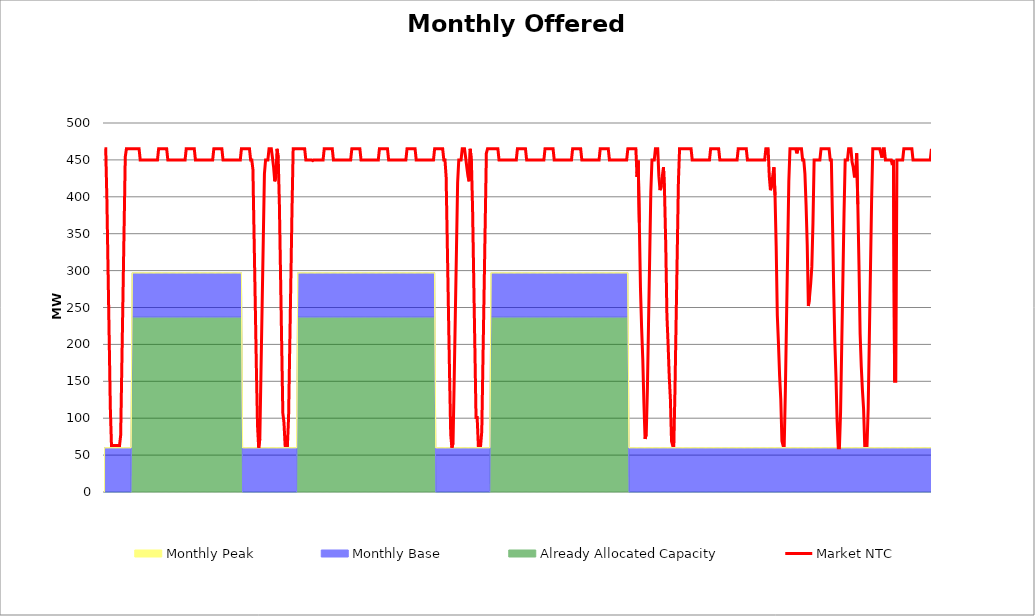
| Category | Market NTC |
|---|---|
| 0 | 465 |
| 1 | 465 |
| 2 | 397 |
| 3 | 303 |
| 4 | 209 |
| 5 | 114 |
| 6 | 63 |
| 7 | 63 |
| 8 | 63 |
| 9 | 63 |
| 10 | 63 |
| 11 | 63 |
| 12 | 63 |
| 13 | 63 |
| 14 | 77 |
| 15 | 171 |
| 16 | 265 |
| 17 | 360 |
| 18 | 454 |
| 19 | 465 |
| 20 | 465 |
| 21 | 465 |
| 22 | 465 |
| 23 | 465 |
| 24 | 465 |
| 25 | 465 |
| 26 | 465 |
| 27 | 465 |
| 28 | 465 |
| 29 | 465 |
| 30 | 465 |
| 31 | 450 |
| 32 | 450 |
| 33 | 450 |
| 34 | 450 |
| 35 | 450 |
| 36 | 450 |
| 37 | 450 |
| 38 | 450 |
| 39 | 450 |
| 40 | 450 |
| 41 | 450 |
| 42 | 450 |
| 43 | 450 |
| 44 | 450 |
| 45 | 450 |
| 46 | 450 |
| 47 | 465 |
| 48 | 465 |
| 49 | 465 |
| 50 | 465 |
| 51 | 465 |
| 52 | 465 |
| 53 | 465 |
| 54 | 465 |
| 55 | 450 |
| 56 | 450 |
| 57 | 450 |
| 58 | 450 |
| 59 | 450 |
| 60 | 450 |
| 61 | 450 |
| 62 | 450 |
| 63 | 450 |
| 64 | 450 |
| 65 | 450 |
| 66 | 450 |
| 67 | 450 |
| 68 | 450 |
| 69 | 450 |
| 70 | 450 |
| 71 | 465 |
| 72 | 465 |
| 73 | 465 |
| 74 | 465 |
| 75 | 465 |
| 76 | 465 |
| 77 | 465 |
| 78 | 465 |
| 79 | 450 |
| 80 | 450 |
| 81 | 450 |
| 82 | 450 |
| 83 | 450 |
| 84 | 450 |
| 85 | 450 |
| 86 | 450 |
| 87 | 450 |
| 88 | 450 |
| 89 | 450 |
| 90 | 450 |
| 91 | 450 |
| 92 | 450 |
| 93 | 450 |
| 94 | 450 |
| 95 | 465 |
| 96 | 465 |
| 97 | 465 |
| 98 | 465 |
| 99 | 465 |
| 100 | 465 |
| 101 | 465 |
| 102 | 465 |
| 103 | 450 |
| 104 | 450 |
| 105 | 450 |
| 106 | 450 |
| 107 | 450 |
| 108 | 450 |
| 109 | 450 |
| 110 | 450 |
| 111 | 450 |
| 112 | 450 |
| 113 | 450 |
| 114 | 450 |
| 115 | 450 |
| 116 | 450 |
| 117 | 450 |
| 118 | 450 |
| 119 | 465 |
| 120 | 465 |
| 121 | 465 |
| 122 | 465 |
| 123 | 465 |
| 124 | 465 |
| 125 | 465 |
| 126 | 465 |
| 127 | 450 |
| 128 | 450 |
| 129 | 437 |
| 130 | 347 |
| 131 | 258 |
| 132 | 168 |
| 133 | 90 |
| 134 | 60 |
| 135 | 72 |
| 136 | 162 |
| 137 | 252 |
| 138 | 341 |
| 139 | 431 |
| 140 | 450 |
| 141 | 450 |
| 142 | 450 |
| 143 | 465 |
| 144 | 465 |
| 145 | 465 |
| 146 | 453 |
| 147 | 440 |
| 148 | 421 |
| 149 | 428 |
| 150 | 465 |
| 151 | 453 |
| 152 | 390 |
| 153 | 296 |
| 154 | 201 |
| 155 | 107 |
| 156 | 94 |
| 157 | 63 |
| 158 | 63 |
| 159 | 63 |
| 160 | 101 |
| 161 | 195 |
| 162 | 289 |
| 163 | 384 |
| 164 | 465 |
| 165 | 465 |
| 166 | 465 |
| 167 | 465 |
| 168 | 465 |
| 169 | 465 |
| 170 | 465 |
| 171 | 465 |
| 172 | 465 |
| 173 | 465 |
| 174 | 465 |
| 175 | 450 |
| 176 | 450 |
| 177 | 450 |
| 178 | 450 |
| 179 | 450 |
| 180 | 450 |
| 181 | 449 |
| 182 | 450 |
| 183 | 450 |
| 184 | 450 |
| 185 | 450 |
| 186 | 450 |
| 187 | 450 |
| 188 | 450 |
| 189 | 450 |
| 190 | 450 |
| 191 | 465 |
| 192 | 465 |
| 193 | 465 |
| 194 | 465 |
| 195 | 465 |
| 196 | 465 |
| 197 | 465 |
| 198 | 465 |
| 199 | 450 |
| 200 | 450 |
| 201 | 450 |
| 202 | 450 |
| 203 | 450 |
| 204 | 450 |
| 205 | 450 |
| 206 | 450 |
| 207 | 450 |
| 208 | 450 |
| 209 | 450 |
| 210 | 450 |
| 211 | 450 |
| 212 | 450 |
| 213 | 450 |
| 214 | 450 |
| 215 | 465 |
| 216 | 465 |
| 217 | 465 |
| 218 | 465 |
| 219 | 465 |
| 220 | 465 |
| 221 | 465 |
| 222 | 465 |
| 223 | 450 |
| 224 | 450 |
| 225 | 450 |
| 226 | 450 |
| 227 | 450 |
| 228 | 450 |
| 229 | 450 |
| 230 | 450 |
| 231 | 450 |
| 232 | 450 |
| 233 | 450 |
| 234 | 450 |
| 235 | 450 |
| 236 | 450 |
| 237 | 450 |
| 238 | 450 |
| 239 | 465 |
| 240 | 465 |
| 241 | 465 |
| 242 | 465 |
| 243 | 465 |
| 244 | 465 |
| 245 | 465 |
| 246 | 465 |
| 247 | 450 |
| 248 | 450 |
| 249 | 450 |
| 250 | 450 |
| 251 | 450 |
| 252 | 450 |
| 253 | 450 |
| 254 | 450 |
| 255 | 450 |
| 256 | 450 |
| 257 | 450 |
| 258 | 450 |
| 259 | 450 |
| 260 | 450 |
| 261 | 450 |
| 262 | 450 |
| 263 | 465 |
| 264 | 465 |
| 265 | 465 |
| 266 | 465 |
| 267 | 465 |
| 268 | 465 |
| 269 | 465 |
| 270 | 465 |
| 271 | 450 |
| 272 | 450 |
| 273 | 450 |
| 274 | 450 |
| 275 | 450 |
| 276 | 450 |
| 277 | 450 |
| 278 | 450 |
| 279 | 450 |
| 280 | 450 |
| 281 | 450 |
| 282 | 450 |
| 283 | 450 |
| 284 | 450 |
| 285 | 450 |
| 286 | 450 |
| 287 | 465 |
| 288 | 465 |
| 289 | 465 |
| 290 | 465 |
| 291 | 465 |
| 292 | 465 |
| 293 | 465 |
| 294 | 465 |
| 295 | 450 |
| 296 | 450 |
| 297 | 427 |
| 298 | 338 |
| 299 | 248 |
| 300 | 158 |
| 301 | 78 |
| 302 | 60 |
| 303 | 66 |
| 304 | 150 |
| 305 | 240 |
| 306 | 329 |
| 307 | 419 |
| 308 | 450 |
| 309 | 450 |
| 310 | 450 |
| 311 | 465 |
| 312 | 465 |
| 313 | 465 |
| 314 | 453 |
| 315 | 440 |
| 316 | 428 |
| 317 | 421 |
| 318 | 465 |
| 319 | 447 |
| 320 | 384 |
| 321 | 289 |
| 322 | 195 |
| 323 | 101 |
| 324 | 101 |
| 325 | 63 |
| 326 | 63 |
| 327 | 63 |
| 328 | 82 |
| 329 | 176 |
| 330 | 270 |
| 331 | 365 |
| 332 | 459 |
| 333 | 465 |
| 334 | 465 |
| 335 | 465 |
| 336 | 465 |
| 337 | 465 |
| 338 | 465 |
| 339 | 465 |
| 340 | 465 |
| 341 | 465 |
| 342 | 465 |
| 343 | 450 |
| 344 | 450 |
| 345 | 450 |
| 346 | 450 |
| 347 | 450 |
| 348 | 450 |
| 349 | 450 |
| 350 | 450 |
| 351 | 450 |
| 352 | 450 |
| 353 | 450 |
| 354 | 450 |
| 355 | 450 |
| 356 | 450 |
| 357 | 450 |
| 358 | 450 |
| 359 | 465 |
| 360 | 465 |
| 361 | 465 |
| 362 | 465 |
| 363 | 465 |
| 364 | 465 |
| 365 | 465 |
| 366 | 465 |
| 367 | 450 |
| 368 | 450 |
| 369 | 450 |
| 370 | 450 |
| 371 | 450 |
| 372 | 450 |
| 373 | 450 |
| 374 | 450 |
| 375 | 450 |
| 376 | 450 |
| 377 | 450 |
| 378 | 450 |
| 379 | 450 |
| 380 | 450 |
| 381 | 450 |
| 382 | 450 |
| 383 | 465 |
| 384 | 465 |
| 385 | 465 |
| 386 | 465 |
| 387 | 465 |
| 388 | 465 |
| 389 | 465 |
| 390 | 465 |
| 391 | 450 |
| 392 | 450 |
| 393 | 450 |
| 394 | 450 |
| 395 | 450 |
| 396 | 450 |
| 397 | 450 |
| 398 | 450 |
| 399 | 450 |
| 400 | 450 |
| 401 | 450 |
| 402 | 450 |
| 403 | 450 |
| 404 | 450 |
| 405 | 450 |
| 406 | 450 |
| 407 | 465 |
| 408 | 465 |
| 409 | 465 |
| 410 | 465 |
| 411 | 465 |
| 412 | 465 |
| 413 | 465 |
| 414 | 465 |
| 415 | 450 |
| 416 | 450 |
| 417 | 450 |
| 418 | 450 |
| 419 | 450 |
| 420 | 450 |
| 421 | 450 |
| 422 | 450 |
| 423 | 450 |
| 424 | 450 |
| 425 | 450 |
| 426 | 450 |
| 427 | 450 |
| 428 | 450 |
| 429 | 450 |
| 430 | 450 |
| 431 | 465 |
| 432 | 465 |
| 433 | 465 |
| 434 | 465 |
| 435 | 465 |
| 436 | 465 |
| 437 | 465 |
| 438 | 465 |
| 439 | 450 |
| 440 | 450 |
| 441 | 450 |
| 442 | 450 |
| 443 | 450 |
| 444 | 450 |
| 445 | 450 |
| 446 | 450 |
| 447 | 450 |
| 448 | 450 |
| 449 | 450 |
| 450 | 450 |
| 451 | 450 |
| 452 | 450 |
| 453 | 450 |
| 454 | 450 |
| 455 | 465 |
| 456 | 465 |
| 457 | 465 |
| 458 | 465 |
| 459 | 465 |
| 460 | 465 |
| 461 | 465 |
| 462 | 465 |
| 463 | 427 |
| 464 | 449 |
| 465 | 365 |
| 466 | 276 |
| 467 | 222 |
| 468 | 180 |
| 469 | 120 |
| 470 | 72 |
| 471 | 78 |
| 472 | 138 |
| 473 | 228 |
| 474 | 317 |
| 475 | 407 |
| 476 | 450 |
| 477 | 450 |
| 478 | 450 |
| 479 | 465 |
| 480 | 465 |
| 481 | 465 |
| 482 | 428 |
| 483 | 409 |
| 484 | 415 |
| 485 | 428 |
| 486 | 440 |
| 487 | 402 |
| 488 | 333 |
| 489 | 239 |
| 490 | 201 |
| 491 | 157 |
| 492 | 126 |
| 493 | 69 |
| 494 | 63 |
| 495 | 63 |
| 496 | 138 |
| 497 | 233 |
| 498 | 327 |
| 499 | 421 |
| 500 | 465 |
| 501 | 465 |
| 502 | 465 |
| 503 | 465 |
| 504 | 465 |
| 505 | 465 |
| 506 | 465 |
| 507 | 465 |
| 508 | 465 |
| 509 | 465 |
| 510 | 465 |
| 511 | 450 |
| 512 | 450 |
| 513 | 450 |
| 514 | 450 |
| 515 | 450 |
| 516 | 450 |
| 517 | 450 |
| 518 | 450 |
| 519 | 450 |
| 520 | 450 |
| 521 | 450 |
| 522 | 450 |
| 523 | 450 |
| 524 | 450 |
| 525 | 450 |
| 526 | 450 |
| 527 | 465 |
| 528 | 465 |
| 529 | 465 |
| 530 | 465 |
| 531 | 465 |
| 532 | 465 |
| 533 | 465 |
| 534 | 465 |
| 535 | 450 |
| 536 | 450 |
| 537 | 450 |
| 538 | 450 |
| 539 | 450 |
| 540 | 450 |
| 541 | 450 |
| 542 | 450 |
| 543 | 450 |
| 544 | 450 |
| 545 | 450 |
| 546 | 450 |
| 547 | 450 |
| 548 | 450 |
| 549 | 450 |
| 550 | 450 |
| 551 | 465 |
| 552 | 465 |
| 553 | 465 |
| 554 | 465 |
| 555 | 465 |
| 556 | 465 |
| 557 | 465 |
| 558 | 465 |
| 559 | 450 |
| 560 | 450 |
| 561 | 450 |
| 562 | 450 |
| 563 | 450 |
| 564 | 450 |
| 565 | 450 |
| 566 | 450 |
| 567 | 450 |
| 568 | 450 |
| 569 | 450 |
| 570 | 450 |
| 571 | 450 |
| 572 | 450 |
| 573 | 450 |
| 574 | 450 |
| 575 | 465 |
| 576 | 465 |
| 577 | 465 |
| 578 | 428 |
| 579 | 409 |
| 580 | 415 |
| 581 | 428 |
| 582 | 440 |
| 583 | 402 |
| 584 | 333 |
| 585 | 239 |
| 586 | 201 |
| 587 | 157 |
| 588 | 126 |
| 589 | 69 |
| 590 | 63 |
| 591 | 63 |
| 592 | 138 |
| 593 | 233 |
| 594 | 327 |
| 595 | 421 |
| 596 | 465 |
| 597 | 465 |
| 598 | 465 |
| 599 | 465 |
| 600 | 465 |
| 601 | 465 |
| 602 | 459 |
| 603 | 465 |
| 604 | 465 |
| 605 | 465 |
| 606 | 465 |
| 607 | 450 |
| 608 | 450 |
| 609 | 431 |
| 610 | 389 |
| 611 | 335 |
| 612 | 252 |
| 613 | 264 |
| 614 | 282 |
| 615 | 305 |
| 616 | 365 |
| 617 | 450 |
| 618 | 450 |
| 619 | 450 |
| 620 | 450 |
| 621 | 450 |
| 622 | 450 |
| 623 | 465 |
| 624 | 465 |
| 625 | 465 |
| 626 | 465 |
| 627 | 465 |
| 628 | 465 |
| 629 | 465 |
| 630 | 465 |
| 631 | 450 |
| 632 | 450 |
| 633 | 365 |
| 634 | 276 |
| 635 | 204 |
| 636 | 156 |
| 637 | 96 |
| 638 | 60 |
| 639 | 60 |
| 640 | 108 |
| 641 | 198 |
| 642 | 287 |
| 643 | 377 |
| 644 | 450 |
| 645 | 450 |
| 646 | 450 |
| 647 | 465 |
| 648 | 465 |
| 649 | 465 |
| 650 | 447 |
| 651 | 440 |
| 652 | 428 |
| 653 | 428 |
| 654 | 459 |
| 655 | 390 |
| 656 | 308 |
| 657 | 214 |
| 658 | 170 |
| 659 | 138 |
| 660 | 113 |
| 661 | 63 |
| 662 | 63 |
| 663 | 63 |
| 664 | 113 |
| 665 | 208 |
| 666 | 302 |
| 667 | 396 |
| 668 | 465 |
| 669 | 465 |
| 670 | 465 |
| 671 | 465 |
| 672 | 465 |
| 673 | 465 |
| 674 | 465 |
| 675 | 459 |
| 676 | 453 |
| 677 | 465 |
| 678 | 465 |
| 679 | 450 |
| 680 | 450 |
| 681 | 450 |
| 682 | 450 |
| 683 | 450 |
| 684 | 450 |
| 685 | 443 |
| 686 | 450 |
| 687 | 150 |
| 688 | 150 |
| 689 | 450 |
| 690 | 450 |
| 691 | 450 |
| 692 | 450 |
| 693 | 450 |
| 694 | 450 |
| 695 | 465 |
| 696 | 465 |
| 697 | 465 |
| 698 | 465 |
| 699 | 465 |
| 700 | 465 |
| 701 | 465 |
| 702 | 465 |
| 703 | 450 |
| 704 | 450 |
| 705 | 450 |
| 706 | 450 |
| 707 | 450 |
| 708 | 450 |
| 709 | 450 |
| 710 | 450 |
| 711 | 450 |
| 712 | 450 |
| 713 | 450 |
| 714 | 450 |
| 715 | 450 |
| 716 | 450 |
| 717 | 450 |
| 718 | 450 |
| 719 | 465 |